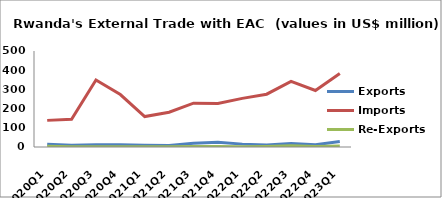
| Category | Exports | Imports | Re-Exports |
|---|---|---|---|
| 2020Q1 | 14.209 | 138.663 | 3.748 |
| 2020Q2 | 8.786 | 144.885 | 1.712 |
| 2020Q3 | 11.767 | 348.723 | 1.141 |
| 2020Q4 | 12.136 | 273.335 | 0.92 |
| 2021Q1 | 9.302 | 158.626 | 0.693 |
| 2021Q2 | 7.396 | 180.858 | 1.076 |
| 2021Q3 | 19.208 | 228.408 | 2.214 |
| 2021Q4 | 24.275 | 227.083 | 3.044 |
| 2022Q1 | 14.976 | 253.288 | 1.717 |
| 2022Q2 | 10.835 | 275.058 | 3.227 |
| 2022Q3 | 18.34 | 341.329 | 6.748 |
| 2022Q4 | 11.691 | 294.155 | 2.456 |
| 2023Q1 | 28.708 | 382.295 | 4.582 |